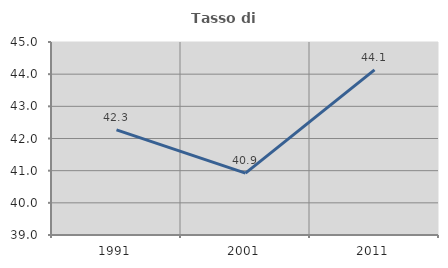
| Category | Tasso di occupazione   |
|---|---|
| 1991.0 | 42.268 |
| 2001.0 | 40.922 |
| 2011.0 | 44.136 |